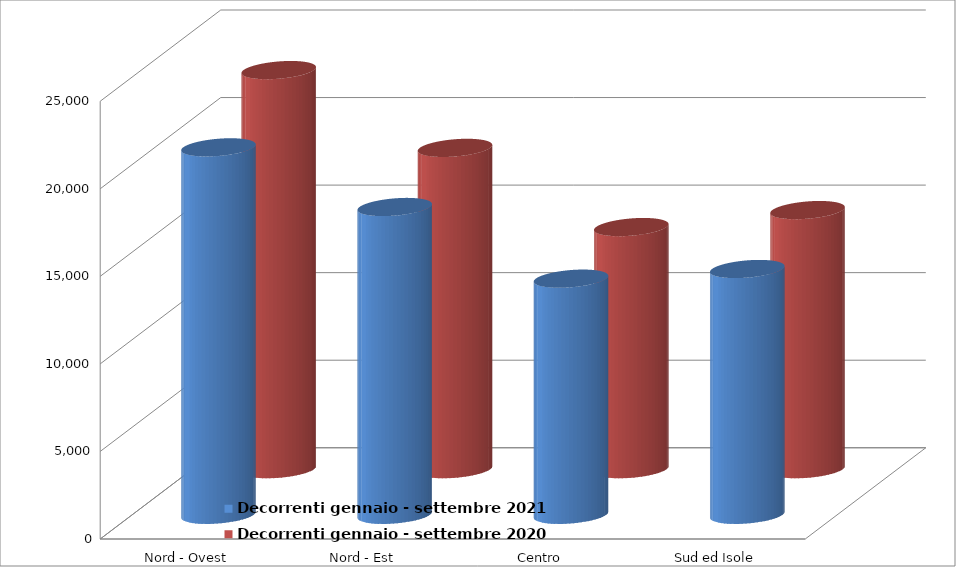
| Category | Decorrenti gennaio - settembre 2021 | Decorrenti gennaio - settembre 2020 |
|---|---|---|
| Nord - Ovest | 20985 | 22793 |
| Nord - Est | 17579 | 18350 |
| Centro | 13486 | 13828 |
| Sud ed Isole | 14038 | 14798 |